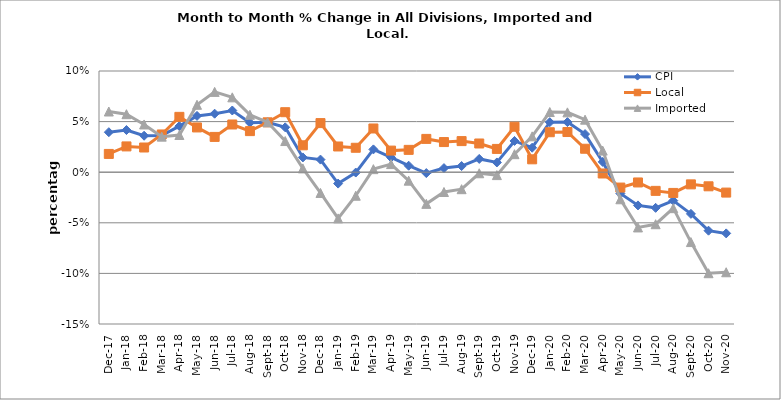
| Category | CPI | Local | Imported |
|---|---|---|---|
| 2017-12-01 | 0.04 | 0.018 | 0.06 |
| 2018-01-01 | 0.042 | 0.025 | 0.057 |
| 2018-02-01 | 0.036 | 0.024 | 0.047 |
| 2018-03-01 | 0.036 | 0.037 | 0.035 |
| 2018-04-01 | 0.045 | 0.055 | 0.037 |
| 2018-05-01 | 0.056 | 0.044 | 0.067 |
| 2018-06-01 | 0.058 | 0.035 | 0.079 |
| 2018-07-01 | 0.061 | 0.047 | 0.074 |
| 2018-08-01 | 0.049 | 0.041 | 0.057 |
| 2018-09-01 | 0.049 | 0.049 | 0.049 |
| 2018-10-01 | 0.044 | 0.059 | 0.031 |
| 2018-11-01 | 0.015 | 0.027 | 0.004 |
| 2018-12-01 | 0.012 | 0.049 | -0.021 |
| 2019-01-01 | -0.011 | 0.025 | -0.046 |
| 2019-02-01 | 0 | 0.024 | -0.023 |
| 2019-03-01 | 0.023 | 0.043 | 0.003 |
| 2019-04-01 | 0.015 | 0.021 | 0.008 |
| 2019-05-01 | 0.006 | 0.022 | -0.008 |
| 2019-06-01 | -0.001 | 0.033 | -0.031 |
| 2019-07-01 | 0.004 | 0.03 | -0.02 |
| 2019-08-01 | 0.006 | 0.031 | -0.017 |
| 2019-09-01 | 0.013 | 0.028 | -0.001 |
| 2019-10-01 | 0.01 | 0.023 | -0.003 |
| 2019-11-01 | 0.031 | 0.045 | 0.018 |
| 2019-12-01 | 0.024 | 0.013 | 0.035 |
| 2020-01-01 | 0.049 | 0.039 | 0.059 |
| 2020-02-01 | 0.05 | 0.04 | 0.059 |
| 2020-03-01 | 0.038 | 0.023 | 0.052 |
| 2020-04-01 | 0.01 | -0.001 | 0.021 |
| 2020-05-01 | -0.021 | -0.015 | -0.027 |
| 2020-06-01 | -0.033 | -0.01 | -0.055 |
| 2020-07-01 | -0.035 | -0.018 | -0.051 |
| 2020-08-01 | -0.028 | -0.02 | -0.036 |
| 2020-09-01 | -0.041 | -0.012 | -0.069 |
| 2020-10-01 | -0.058 | -0.014 | -0.1 |
| 2020-11-01 | -0.06 | -0.02 | -0.099 |